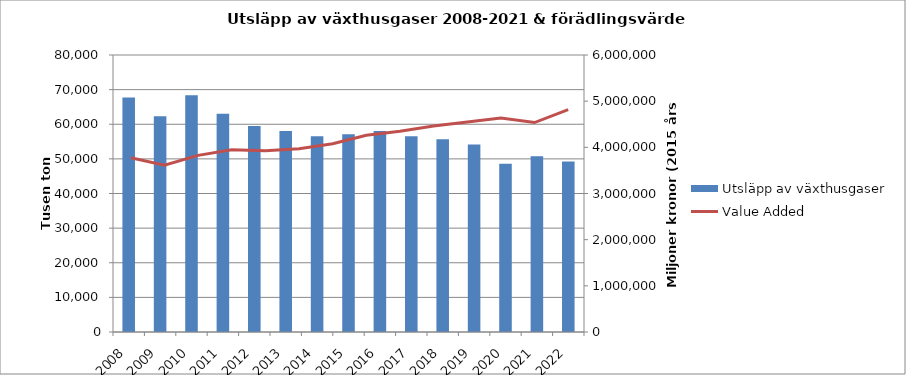
| Category | Utsläpp av växthusgaser |
|---|---|
| 2008 | 67717.391 |
| 2009 | 62277.441 |
| 2010 | 68399.516 |
| 2011 | 63038.316 |
| 2012 | 59484.613 |
| 2013 | 58076.112 |
| 2014 | 56563.955 |
| 2015 | 57086.716 |
| 2016 | 58024.947 |
| 2017 | 56508.016 |
| 2018 | 55635.151 |
| 2019 | 54183.589 |
| 2020 | 48613.09 |
| 2021 | 50746.847 |
| 2022 | 49273.923 |